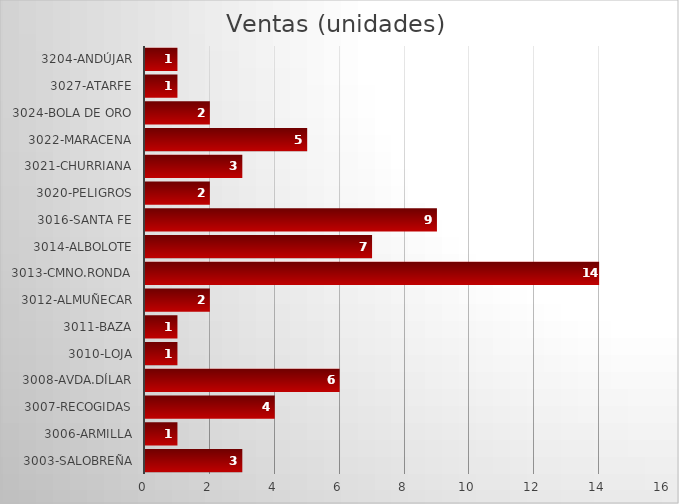
| Category | Ventas (unidades) |
|---|---|
| 3003-Salobreña | 3 |
| 3006-Armilla | 1 |
| 3007-Recogidas | 4 |
| 3008-Avda.Dílar | 6 |
| 3010-Loja | 1 |
| 3011-Baza | 1 |
| 3012-Almuñecar | 2 |
| 3013-Cmno.Ronda | 14 |
| 3014-Albolote | 7 |
| 3016-Santa Fe | 9 |
| 3020-Peligros | 2 |
| 3021-Churriana | 3 |
| 3022-Maracena | 5 |
| 3024-Bola de Oro | 2 |
| 3027-Atarfe | 1 |
| 3204-Andújar | 1 |